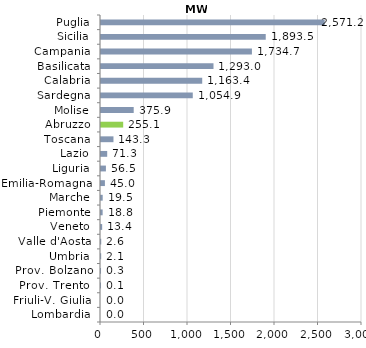
| Category | Series 0 |
|---|---|
| Lombardia | 0 |
| Friuli-V. Giulia | 0 |
| Prov. Trento  | 0.1 |
| Prov. Bolzano | 0.3 |
| Umbria | 2.1 |
| Valle d'Aosta | 2.6 |
| Veneto | 13.4 |
| Piemonte | 18.8 |
| Marche | 19.5 |
| Emilia-Romagna | 45 |
| Liguria | 56.5 |
| Lazio | 71.3 |
| Toscana | 143.3 |
| Abruzzo | 255.1 |
| Molise | 375.9 |
| Sardegna | 1054.9 |
| Calabria | 1163.4 |
| Basilicata | 1293 |
| Campania | 1734.7 |
| Sicilia | 1893.5 |
| Puglia | 2571.2 |